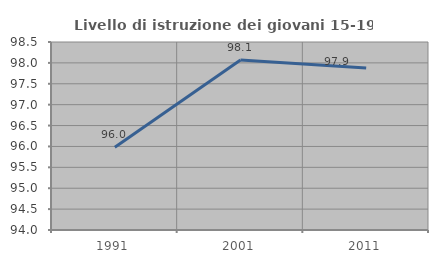
| Category | Livello di istruzione dei giovani 15-19 anni |
|---|---|
| 1991.0 | 95.98 |
| 2001.0 | 98.067 |
| 2011.0 | 97.875 |